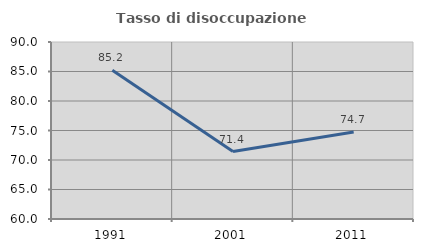
| Category | Tasso di disoccupazione giovanile  |
|---|---|
| 1991.0 | 85.215 |
| 2001.0 | 71.429 |
| 2011.0 | 74.747 |